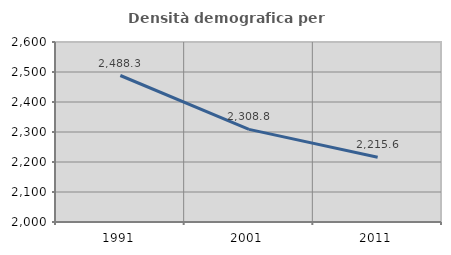
| Category | Densità demografica |
|---|---|
| 1991.0 | 2488.305 |
| 2001.0 | 2308.798 |
| 2011.0 | 2215.569 |